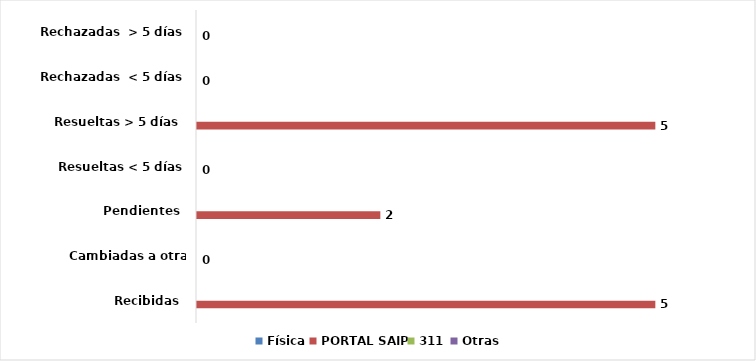
| Category | Física | PORTAL SAIP | 311 | Otras |
|---|---|---|---|---|
| Recibidas  | 0 | 5 | 0 | 0 |
| Cambiadas a otra institución | 0 | 0 | 0 | 0 |
| Pendientes  | 0 | 2 | 0 | 0 |
| Resueltas < 5 días | 0 | 0 | 0 | 0 |
| Resueltas > 5 días  | 0 | 5 | 0 | 0 |
| Rechazadas  < 5 días | 0 | 0 | 0 | 0 |
| Rechazadas  > 5 días | 0 | 0 | 0 | 0 |